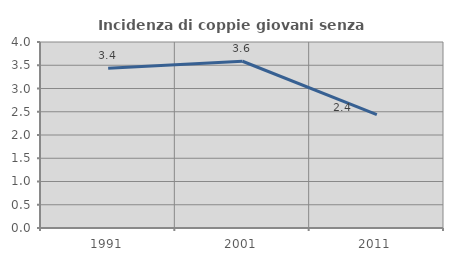
| Category | Incidenza di coppie giovani senza figli |
|---|---|
| 1991.0 | 3.433 |
| 2001.0 | 3.586 |
| 2011.0 | 2.439 |